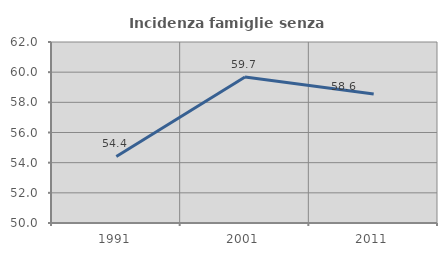
| Category | Incidenza famiglie senza nuclei |
|---|---|
| 1991.0 | 54.412 |
| 2001.0 | 59.677 |
| 2011.0 | 58.559 |